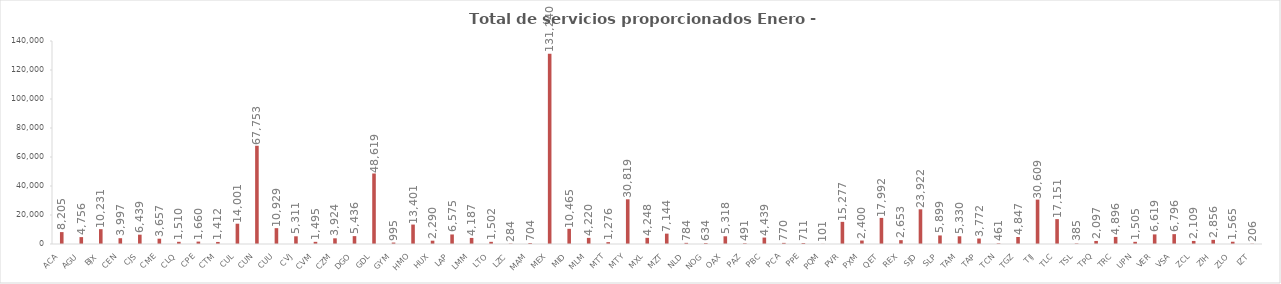
| Category | Total de servicios proporcionados Enero - Octubre |
|---|---|
| ACA | 8205 |
| AGU | 4756 |
| BJX | 10231 |
| CEN | 3997 |
| CJS | 6439 |
| CME | 3657 |
| CLQ | 1510 |
| CPE | 1660 |
| CTM | 1412 |
| CUL | 14001 |
| CUN | 67753 |
| CUU | 10929 |
| CVJ | 5311 |
| CVM | 1495 |
| CZM | 3924 |
| DGO | 5436 |
| GDL | 48619 |
| GYM | 995 |
| HMO | 13401 |
| HUX | 2290 |
| LAP | 6575 |
| LMM | 4187 |
| LTO | 1502 |
| LZC | 284 |
| MAM | 704 |
| MEX | 131240 |
| MID | 10465 |
| MLM | 4220 |
| MTT | 1276 |
| MTY | 30819 |
| MXL | 4248 |
| MZT | 7144 |
| NLD | 784 |
| NOG | 634 |
| OAX | 5318 |
| PAZ | 491 |
| PBC | 4439 |
| PCA | 770 |
| PPE | 711 |
| PQM | 101 |
| PVR | 15277 |
| PXM | 2400 |
| QET | 17992 |
| REX | 2653 |
| SJD | 23922 |
| SLP | 5899 |
| TAM | 5330 |
| TAP | 3772 |
| TCN | 461 |
| TGZ | 4847 |
| TIJ | 30609 |
| TLC | 17151 |
| TSL | 385 |
| TPQ | 2097 |
| TRC | 4896 |
| UPN | 1505 |
| VER | 6619 |
| VSA | 6796 |
| ZCL | 2109 |
| ZIH | 2856 |
| ZLO | 1565 |
| IZT | 206 |